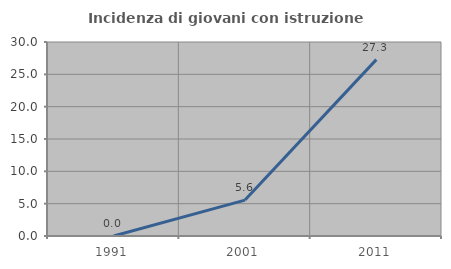
| Category | Incidenza di giovani con istruzione universitaria |
|---|---|
| 1991.0 | 0 |
| 2001.0 | 5.556 |
| 2011.0 | 27.273 |